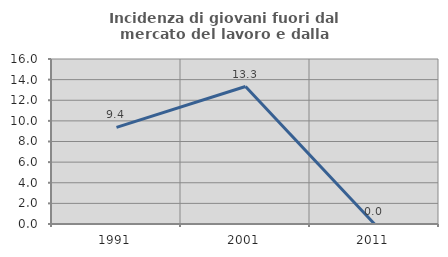
| Category | Incidenza di giovani fuori dal mercato del lavoro e dalla formazione  |
|---|---|
| 1991.0 | 9.375 |
| 2001.0 | 13.333 |
| 2011.0 | 0 |